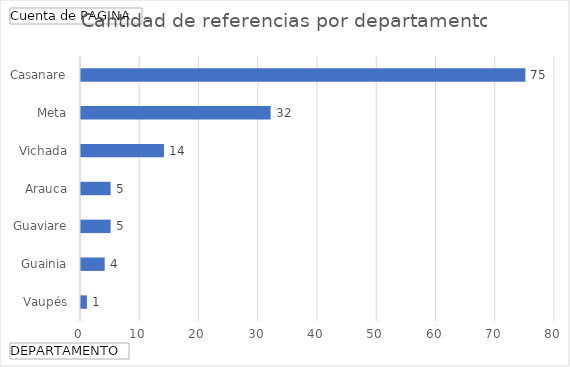
| Category | Total |
|---|---|
| Vaupés | 1 |
| Guainia | 4 |
| Guaviare | 5 |
| Arauca | 5 |
| Vichada | 14 |
| Meta | 32 |
| Casanare | 75 |